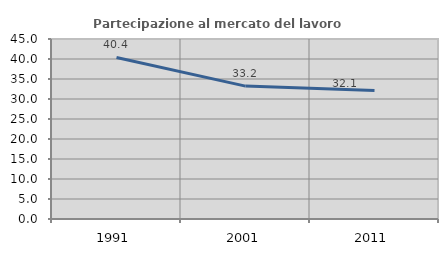
| Category | Partecipazione al mercato del lavoro  femminile |
|---|---|
| 1991.0 | 40.379 |
| 2001.0 | 33.221 |
| 2011.0 | 32.117 |